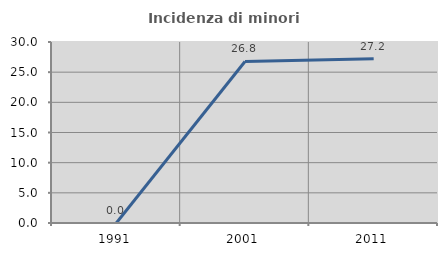
| Category | Incidenza di minori stranieri |
|---|---|
| 1991.0 | 0 |
| 2001.0 | 26.772 |
| 2011.0 | 27.243 |